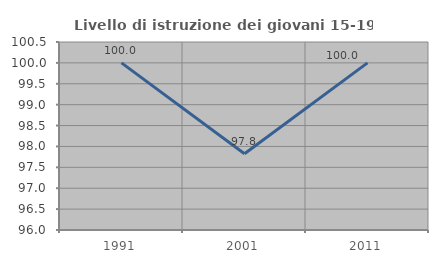
| Category | Livello di istruzione dei giovani 15-19 anni |
|---|---|
| 1991.0 | 100 |
| 2001.0 | 97.826 |
| 2011.0 | 100 |